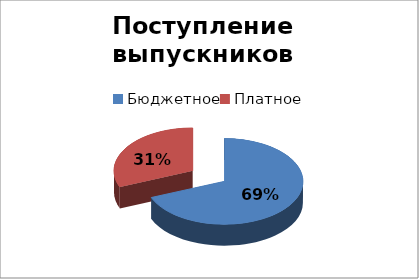
| Category | Series 0 |
|---|---|
| Бюджетное | 42 |
| Платное  | 19 |